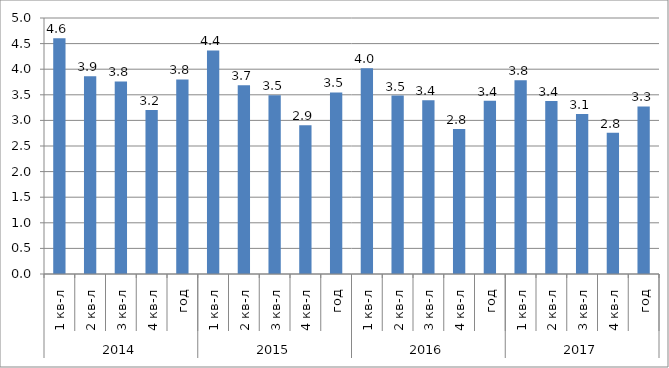
| Category | Series 0 |
|---|---|
| 0 | 4.604 |
| 1 | 3.863 |
| 2 | 3.762 |
| 3 | 3.202 |
| 4 | 3.8 |
| 5 | 4.366 |
| 6 | 3.689 |
| 7 | 3.49 |
| 8 | 2.906 |
| 9 | 3.546 |
| 10 | 4.018 |
| 11 | 3.484 |
| 12 | 3.393 |
| 13 | 2.831 |
| 14 | 3.386 |
| 15 | 3.783 |
| 16 | 3.38 |
| 17 | 3.125 |
| 18 | 2.761 |
| 19 | 3.274 |